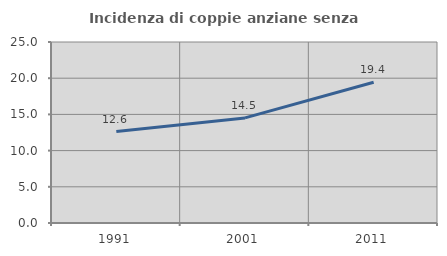
| Category | Incidenza di coppie anziane senza figli  |
|---|---|
| 1991.0 | 12.63 |
| 2001.0 | 14.516 |
| 2011.0 | 19.449 |